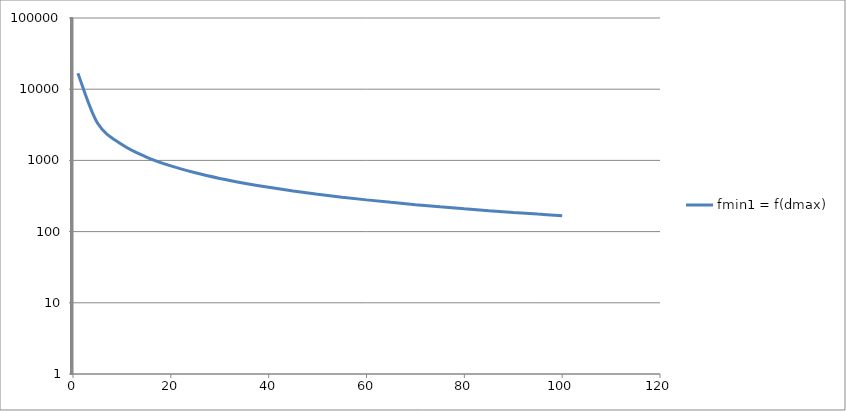
| Category | fmin1 = f(dmax) |
|---|---|
| 1.0 | 16735.135 |
| 5.0 | 3347.027 |
| 10.0 | 1673.514 |
| 15.0 | 1115.676 |
| 20.0 | 836.757 |
| 25.0 | 669.405 |
| 30.0 | 557.838 |
| 35.0 | 478.147 |
| 40.0 | 418.378 |
| 45.0 | 371.892 |
| 50.0 | 334.703 |
| 55.0 | 304.275 |
| 60.0 | 278.919 |
| 65.0 | 257.464 |
| 70.0 | 239.073 |
| 75.0 | 223.135 |
| 80.0 | 209.189 |
| 85.0 | 196.884 |
| 90.0 | 185.946 |
| 95.0 | 176.159 |
| 100.0 | 167.351 |